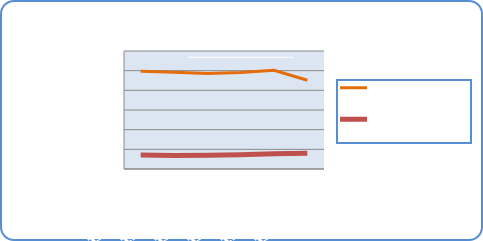
| Category | Motorin Türleri  | Benzin Türleri |
|---|---|---|
| 12/17/18 | 49665796.391 | 7085752.566 |
| 12/18/18 | 49203069.951 | 6921045.529 |
| 12/19/18 | 48570314.907 | 7050263.871 |
| 12/20/18 | 49108756.252 | 7243717.792 |
| 12/21/18 | 50181420.619 | 7740008.06 |
| 12/22/18 | 45120711.955 | 8068283.408 |